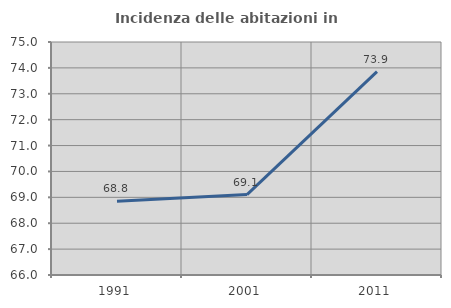
| Category | Incidenza delle abitazioni in proprietà  |
|---|---|
| 1991.0 | 68.849 |
| 2001.0 | 69.106 |
| 2011.0 | 73.859 |